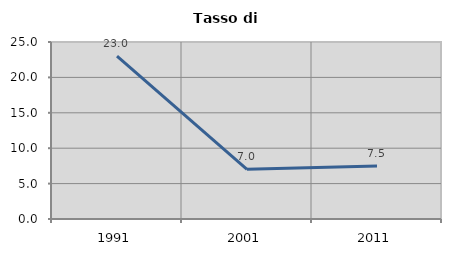
| Category | Tasso di disoccupazione   |
|---|---|
| 1991.0 | 22.989 |
| 2001.0 | 7.009 |
| 2011.0 | 7.489 |